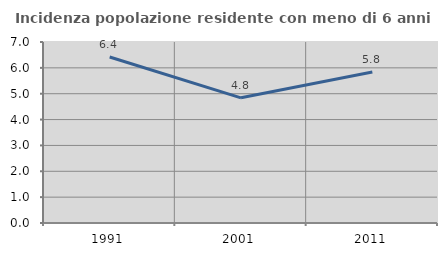
| Category | Incidenza popolazione residente con meno di 6 anni |
|---|---|
| 1991.0 | 6.421 |
| 2001.0 | 4.841 |
| 2011.0 | 5.839 |